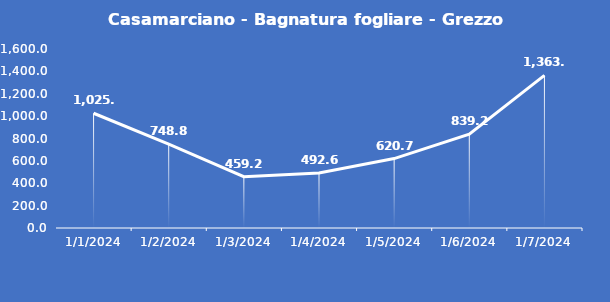
| Category | Casamarciano - Bagnatura fogliare - Grezzo (min) |
|---|---|
| 1/1/24 | 1025.7 |
| 1/2/24 | 748.8 |
| 1/3/24 | 459.2 |
| 1/4/24 | 492.6 |
| 1/5/24 | 620.7 |
| 1/6/24 | 839.2 |
| 1/7/24 | 1363.8 |